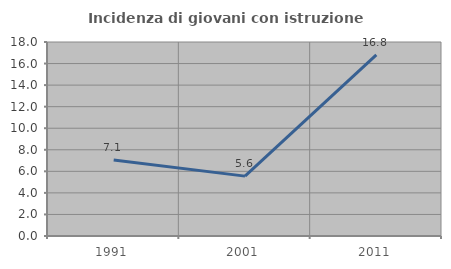
| Category | Incidenza di giovani con istruzione universitaria |
|---|---|
| 1991.0 | 7.051 |
| 2001.0 | 5.556 |
| 2011.0 | 16.814 |